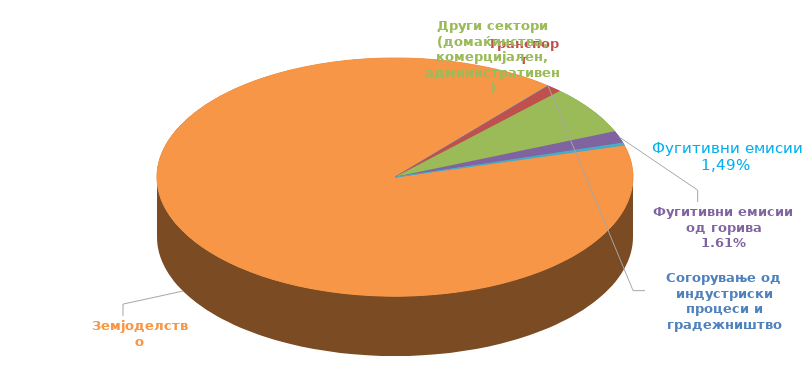
| Category | NH3 |
|---|---|
| 0 | 0.001 |
| 1 | 0.087 |
| 2 | 0.556 |
| 3 | 0.136 |
| 4 | 0.028 |
| 5 | 7.663 |